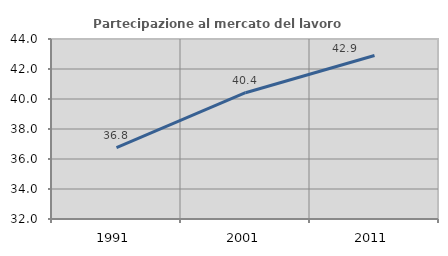
| Category | Partecipazione al mercato del lavoro  femminile |
|---|---|
| 1991.0 | 36.752 |
| 2001.0 | 40.42 |
| 2011.0 | 42.901 |